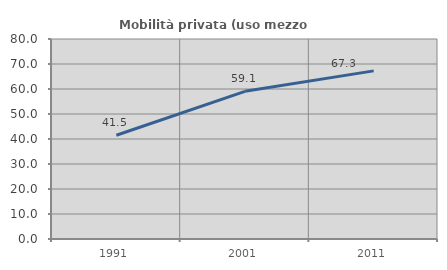
| Category | Mobilità privata (uso mezzo privato) |
|---|---|
| 1991.0 | 41.505 |
| 2001.0 | 59.066 |
| 2011.0 | 67.254 |